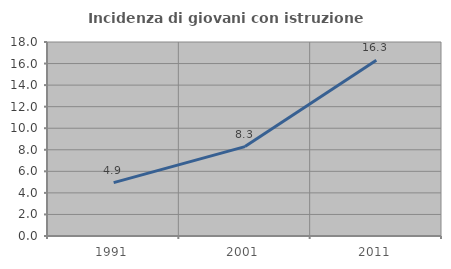
| Category | Incidenza di giovani con istruzione universitaria |
|---|---|
| 1991.0 | 4.949 |
| 2001.0 | 8.296 |
| 2011.0 | 16.306 |